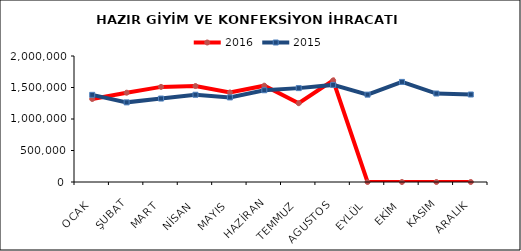
| Category | 2016 | 2015 |
|---|---|---|
| OCAK | 1317822.949 | 1383349.57 |
| ŞUBAT | 1417375.476 | 1264095.138 |
| MART | 1509775.181 | 1324696.299 |
| NİSAN | 1523148.073 | 1384735.182 |
| MAYIS | 1421023.164 | 1342558.461 |
| HAZİRAN | 1528958.576 | 1456441.792 |
| TEMMUZ | 1250788.458 | 1490106.412 |
| AGUSTOS | 1612481.554 | 1541342.842 |
| EYLÜL | 0 | 1386763.302 |
| EKİM | 0 | 1588922.714 |
| KASIM | 0 | 1404344.886 |
| ARALIK | 0 | 1388657.067 |